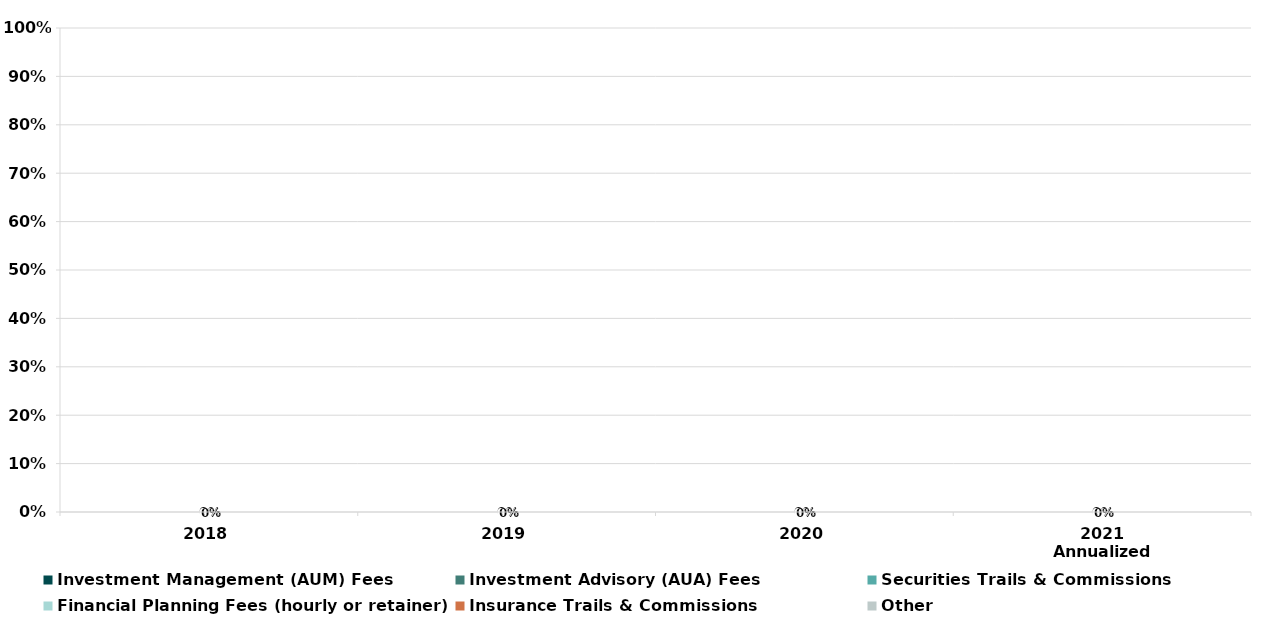
| Category | Investment Management (AUM) Fees | Investment Advisory (AUA) Fees | Securities Trails & Commissions | Financial Planning Fees (hourly or retainer) | Insurance Trails & Commissions | Other |
|---|---|---|---|---|---|---|
| 2018 | 0 | 0 | 0 | 0 | 0 | 0 |
| 2019 | 0 | 0 | 0 | 0 | 0 | 0 |
| 2020 | 0 | 0 | 0 | 0 | 0 | 0 |
| 2021 Annualized | 0 | 0 | 0 | 0 | 0 | 0 |